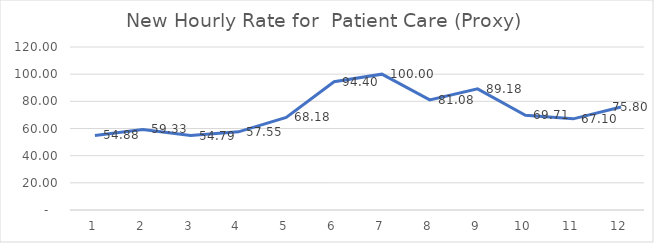
| Category | New Hourly Rate for  Patient Care (Proxy)  |
|---|---|
| 0 | 54.884 |
| 1 | 59.327 |
| 2 | 54.795 |
| 3 | 57.554 |
| 4 | 68.182 |
| 5 | 94.401 |
| 6 | 100.001 |
| 7 | 81.081 |
| 8 | 89.184 |
| 9 | 69.711 |
| 10 | 67.097 |
| 11 | 75.798 |